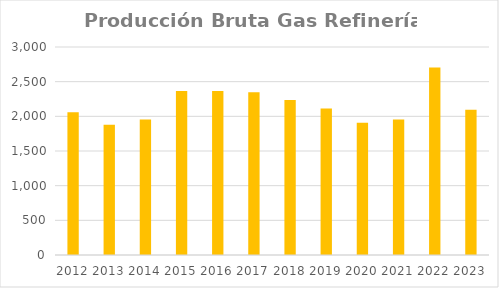
| Category | Series 0 |
|---|---|
| 2012.0 | 2059.343 |
| 2013.0 | 1879.574 |
| 2014.0 | 1955.368 |
| 2015.0 | 2363.979 |
| 2016.0 | 2365.874 |
| 2017.0 | 2346.299 |
| 2018.0 | 2236.378 |
| 2019.0 | 2113.336 |
| 2020.0 | 1907.335 |
| 2021.0 | 1952.643 |
| 2022.0 | 2704.739 |
| 2023.0 | 2094.491 |